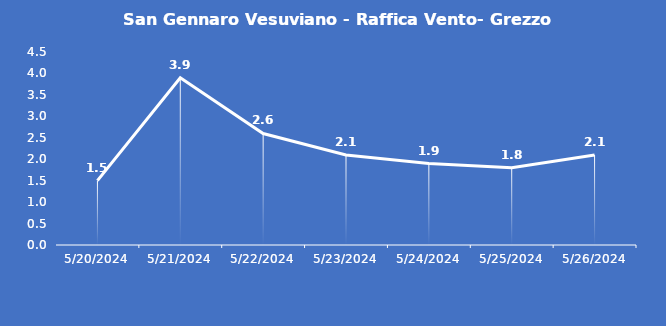
| Category | San Gennaro Vesuviano - Raffica Vento- Grezzo (m/s) |
|---|---|
| 5/20/24 | 1.5 |
| 5/21/24 | 3.9 |
| 5/22/24 | 2.6 |
| 5/23/24 | 2.1 |
| 5/24/24 | 1.9 |
| 5/25/24 | 1.8 |
| 5/26/24 | 2.1 |